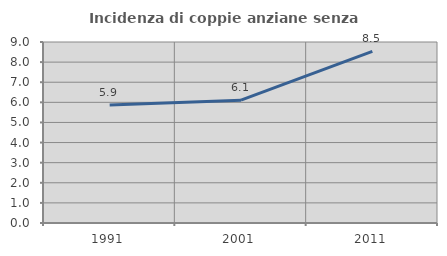
| Category | Incidenza di coppie anziane senza figli  |
|---|---|
| 1991.0 | 5.866 |
| 2001.0 | 6.109 |
| 2011.0 | 8.537 |